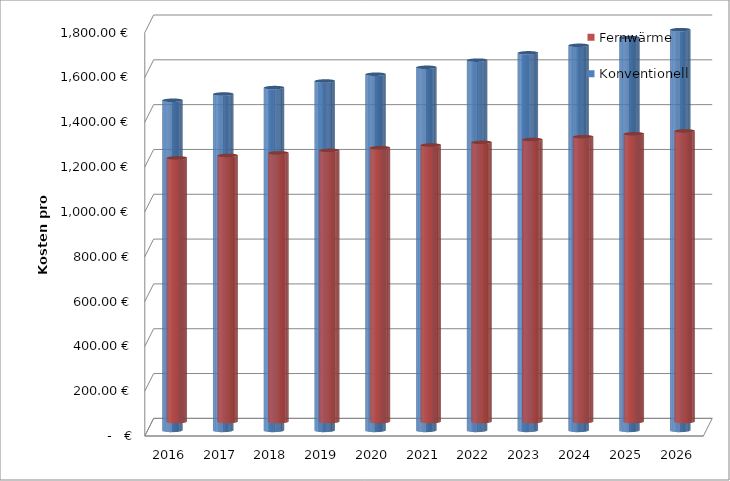
| Category | Fernwärme | Konventionell |
|---|---|---|
| 2016.0 | 1176.861 | 1473.22 |
| 2017.0 | 1187.819 | 1501.137 |
| 2018.0 | 1199.006 | 1529.795 |
| 2019.0 | 1210.429 | 1559.214 |
| 2020.0 | 1222.091 | 1589.414 |
| 2021.0 | 1233.997 | 1620.417 |
| 2022.0 | 1246.153 | 1652.245 |
| 2023.0 | 1258.565 | 1684.92 |
| 2024.0 | 1271.236 | 1718.467 |
| 2025.0 | 1284.174 | 1752.908 |
| 2026.0 | 1297.098 | 1788.269 |